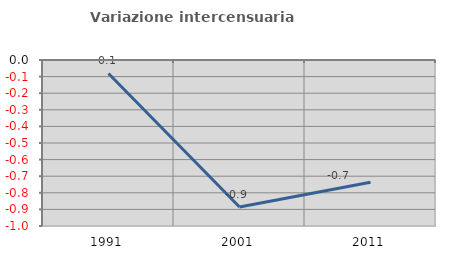
| Category | Variazione intercensuaria annua |
|---|---|
| 1991.0 | -0.081 |
| 2001.0 | -0.886 |
| 2011.0 | -0.736 |